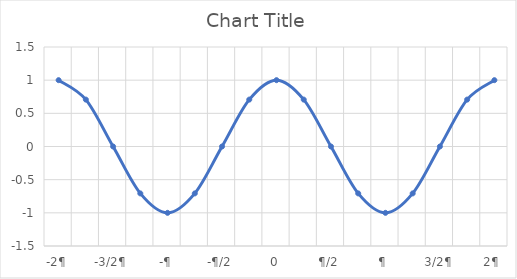
| Category | Series 0 |
|---|---|
| -2¶ | 1 |
|  | 0.707 |
| -3/2¶ | 0 |
|  | -0.707 |
| -¶ | -1 |
|  | -0.707 |
| -¶/2 | 0 |
|  | 0.707 |
| 0 | 1 |
|  | 0.707 |
| ¶/2 | 0 |
|  | -0.707 |
| ¶ | -1 |
|  | -0.707 |
| 3/2¶ | 0 |
|  | 0.707 |
| 2¶ | 1 |